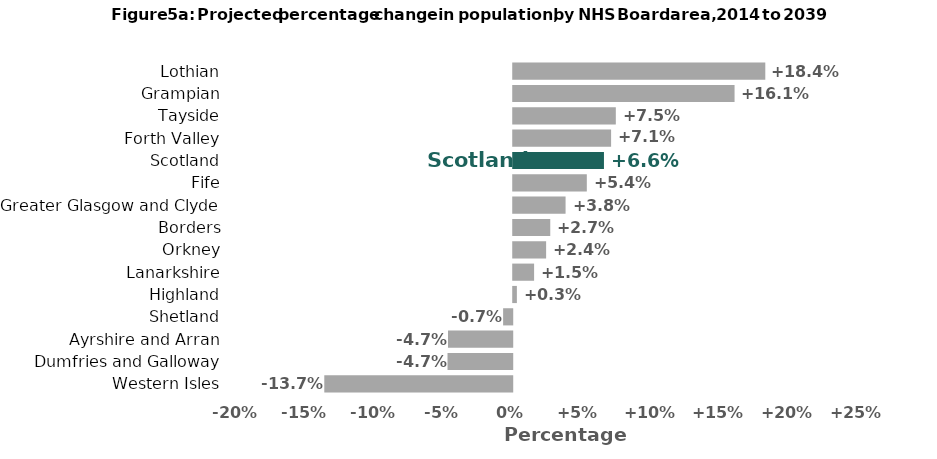
| Category | Percentage change |
|---|---|
| Western Isles | -13.706 |
| Dumfries and Galloway | -4.72 |
| Ayrshire and Arran | -4.683 |
| Shetland | -0.663 |
| Highland | 0.267 |
| Lanarkshire | 1.523 |
| Orkney | 2.4 |
| Borders | 2.701 |
| Greater Glasgow and Clyde | 3.818 |
| Fife | 5.368 |
| Scotland | 6.617 |
| Forth Valley | 7.139 |
| Tayside | 7.483 |
| Grampian | 16.143 |
| Lothian | 18.386 |